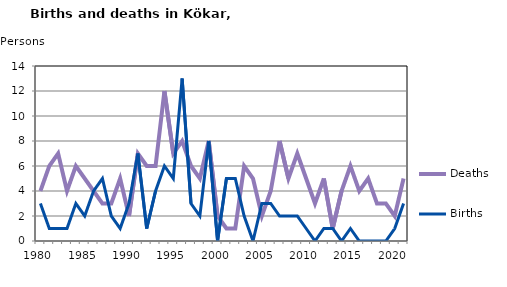
| Category | Deaths | Births |
|---|---|---|
| 1980.0 | 4 | 3 |
| 1981.0 | 6 | 1 |
| 1982.0 | 7 | 1 |
| 1983.0 | 4 | 1 |
| 1984.0 | 6 | 3 |
| 1985.0 | 5 | 2 |
| 1986.0 | 4 | 4 |
| 1987.0 | 3 | 5 |
| 1988.0 | 3 | 2 |
| 1989.0 | 5 | 1 |
| 1990.0 | 2 | 3 |
| 1991.0 | 7 | 7 |
| 1992.0 | 6 | 1 |
| 1993.0 | 6 | 4 |
| 1994.0 | 12 | 6 |
| 1995.0 | 7 | 5 |
| 1996.0 | 8 | 13 |
| 1997.0 | 6 | 3 |
| 1998.0 | 5 | 2 |
| 1999.0 | 8 | 8 |
| 2000.0 | 2 | 0 |
| 2001.0 | 1 | 5 |
| 2002.0 | 1 | 5 |
| 2003.0 | 6 | 2 |
| 2004.0 | 5 | 0 |
| 2005.0 | 2 | 3 |
| 2006.0 | 4 | 3 |
| 2007.0 | 8 | 2 |
| 2008.0 | 5 | 2 |
| 2009.0 | 7 | 2 |
| 2010.0 | 5 | 1 |
| 2011.0 | 3 | 0 |
| 2012.0 | 5 | 1 |
| 2013.0 | 1 | 1 |
| 2014.0 | 4 | 0 |
| 2015.0 | 6 | 1 |
| 2016.0 | 4 | 0 |
| 2017.0 | 5 | 0 |
| 2018.0 | 3 | 0 |
| 2019.0 | 3 | 0 |
| 2020.0 | 2 | 1 |
| 2021.0 | 5 | 3 |